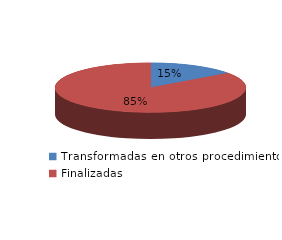
| Category | Series 0 |
|---|---|
| Transformadas en otros procedimientos | 27170 |
| Finalizadas | 156408 |